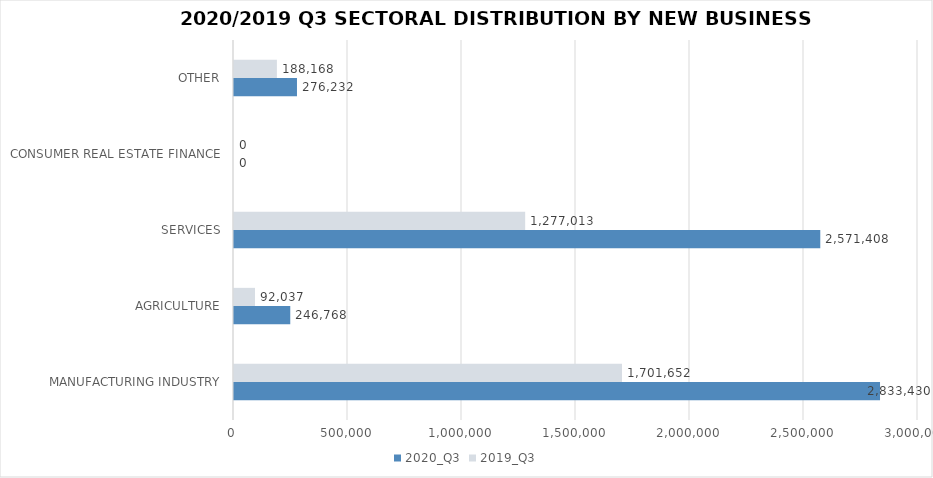
| Category | 2020_Q3 | 2019_Q3 |
|---|---|---|
| MANUFACTURING INDUSTRY | 2833430.156 | 1701651.876 |
| AGRICULTURE | 246767.964 | 92036.645 |
| SERVICES | 2571407.774 | 1277013.446 |
| CONSUMER REAL ESTATE FINANCE | 0 | 0 |
| OTHER | 276232 | 188168.4 |